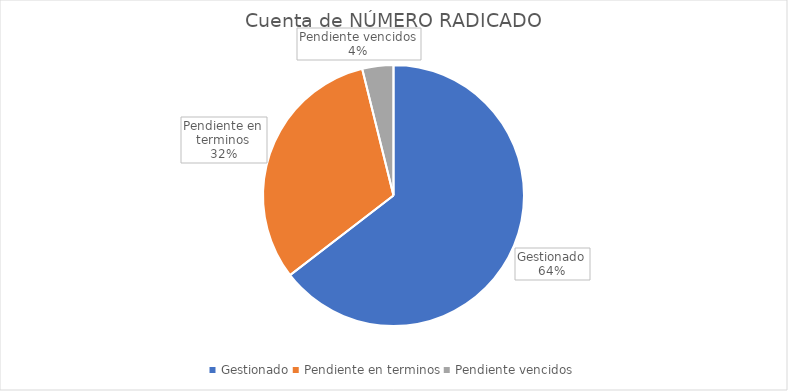
| Category | Cuenta de NÚMERO RADICADO |
|---|---|
| Gestionado | 184 |
| Pendiente en terminos | 90 |
| Pendiente vencidos | 11 |